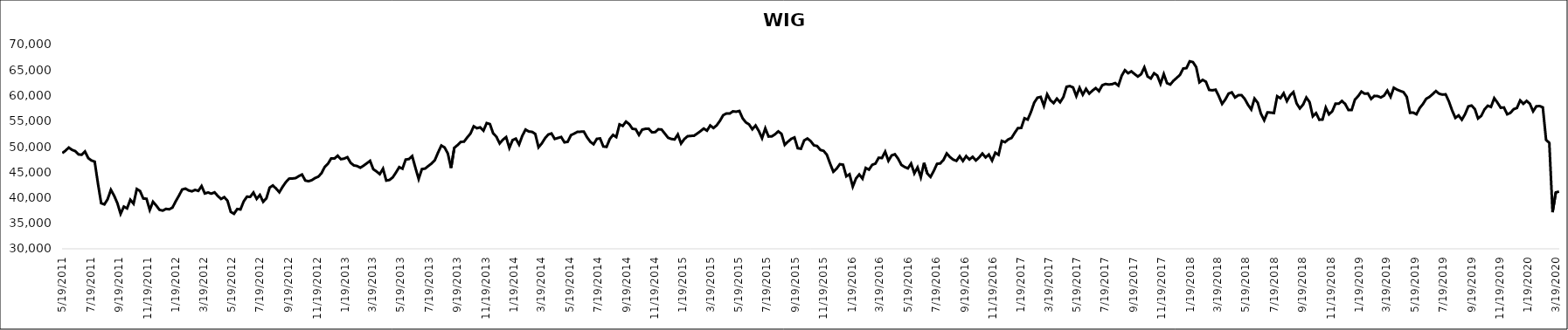
| Category | WIG |
|---|---|
| 5/19/11 | 48747.55 |
| 5/26/11 | 49215.53 |
| 6/2/11 | 49824.93 |
| 6/9/11 | 49378.82 |
| 6/16/11 | 49129.21 |
| 6/23/11 | 48485.26 |
| 6/30/11 | 48414.36 |
| 7/7/11 | 49057.05 |
| 7/14/11 | 47768.38 |
| 7/21/11 | 47291.31 |
| 7/28/11 | 47071.4 |
| 8/4/11 | 42828.22 |
| 8/11/11 | 38934.71 |
| 8/18/11 | 38697.56 |
| 8/25/11 | 39715.27 |
| 9/1/11 | 41553.09 |
| 9/8/11 | 40405.17 |
| 9/15/11 | 38945 |
| 9/22/11 | 36851.2 |
| 9/29/11 | 38264.32 |
| 10/6/11 | 37915.03 |
| 10/13/11 | 39608.13 |
| 10/20/11 | 38835.92 |
| 10/27/11 | 41708.88 |
| 11/3/11 | 41313.92 |
| 11/10/11 | 39853.18 |
| 11/17/11 | 39797.19 |
| 11/24/11 | 37607.27 |
| 12/1/11 | 39215.21 |
| 12/8/11 | 38474.28 |
| 12/15/11 | 37637.47 |
| 12/22/11 | 37478.7 |
| 12/29/11 | 37814.52 |
| 1/5/12 | 37739.39 |
| 1/12/12 | 38062.87 |
| 1/19/12 | 39288.13 |
| 1/26/12 | 40392.48 |
| 2/2/12 | 41602.24 |
| 2/9/12 | 41792.46 |
| 2/16/12 | 41430.3 |
| 2/23/12 | 41258.14 |
| 3/1/12 | 41533.87 |
| 3/8/12 | 41337.97 |
| 3/15/12 | 42281.33 |
| 3/22/12 | 40834.43 |
| 3/29/12 | 41028.06 |
| 4/5/12 | 40802.41 |
| 4/12/12 | 41053.82 |
| 4/19/12 | 40354.53 |
| 4/26/12 | 39761.78 |
| 5/3/12 | 40114.73 |
| 5/10/12 | 39404.16 |
| 5/17/12 | 37228.88 |
| 5/24/12 | 36852.75 |
| 5/31/12 | 37793.58 |
| 6/7/12 | 37707.25 |
| 6/14/12 | 39286.64 |
| 6/21/12 | 40207.61 |
| 6/28/12 | 40165.34 |
| 7/5/12 | 41013.96 |
| 7/12/12 | 39778.1 |
| 7/19/12 | 40545.64 |
| 7/26/12 | 39213.05 |
| 8/2/12 | 39876.95 |
| 8/9/12 | 41976.63 |
| 8/16/12 | 42408.41 |
| 8/23/12 | 41795.63 |
| 8/30/12 | 41077.44 |
| 9/6/12 | 42134.93 |
| 9/13/12 | 43047.41 |
| 9/20/12 | 43737.02 |
| 9/27/12 | 43763.3 |
| 10/4/12 | 43840.23 |
| 10/11/12 | 44224.67 |
| 10/18/12 | 44550.12 |
| 10/25/12 | 43374.6 |
| 11/1/12 | 43232.44 |
| 11/8/12 | 43429.42 |
| 11/15/12 | 43845.94 |
| 11/22/12 | 44121.53 |
| 11/29/12 | 44787.84 |
| 12/6/12 | 46019.97 |
| 12/13/12 | 46653.84 |
| 12/20/12 | 47701.82 |
| 12/27/12 | 47673.03 |
| 1/3/13 | 48222.72 |
| 1/10/13 | 47546.91 |
| 1/17/13 | 47661.37 |
| 1/24/13 | 47942.04 |
| 1/31/13 | 46840.15 |
| 2/7/13 | 46329.66 |
| 2/14/13 | 46211.54 |
| 2/21/13 | 45879.9 |
| 2/28/13 | 46280.36 |
| 3/7/13 | 46745.26 |
| 3/14/13 | 47223.68 |
| 3/21/13 | 45580.47 |
| 3/28/13 | 45147.57 |
| 4/4/13 | 44623.89 |
| 4/11/13 | 45688.48 |
| 4/18/13 | 43364.7 |
| 4/25/13 | 43482.18 |
| 5/2/13 | 43991.51 |
| 5/9/13 | 44943.16 |
| 5/16/13 | 45992.03 |
| 5/23/13 | 45687.76 |
| 5/30/13 | 47476.64 |
| 6/6/13 | 47573.66 |
| 6/13/13 | 48152.82 |
| 6/20/13 | 45870 |
| 6/27/13 | 43667.37 |
| 7/4/13 | 45613.75 |
| 7/11/13 | 45712.72 |
| 7/18/13 | 46221.23 |
| 7/25/13 | 46713.02 |
| 8/1/13 | 47370.81 |
| 8/8/13 | 48862.88 |
| 8/15/13 | 50223.95 |
| 8/22/13 | 49846.48 |
| 8/29/13 | 48676.45 |
| 9/5/13 | 45830.66 |
| 9/12/13 | 49771.55 |
| 9/19/13 | 50300.53 |
| 9/26/13 | 50936.34 |
| 10/3/13 | 50982.03 |
| 10/10/13 | 51806.83 |
| 10/17/13 | 52573.59 |
| 10/24/13 | 53994.46 |
| 10/31/13 | 53607.86 |
| 11/7/13 | 53785.07 |
| 11/14/13 | 53127.16 |
| 11/21/13 | 54621.21 |
| 11/28/13 | 54420.19 |
| 12/5/13 | 52597.13 |
| 12/12/13 | 51947.96 |
| 12/19/13 | 50631.75 |
| 12/26/13 | 51362.3 |
| 1/2/14 | 51865.89 |
| 1/9/14 | 49753.03 |
| 1/16/14 | 51288.7 |
| 1/23/14 | 51569.21 |
| 1/30/14 | 50417.17 |
| 2/6/14 | 52138.87 |
| 2/13/14 | 53349.65 |
| 2/20/14 | 52967.02 |
| 2/27/14 | 52906.04 |
| 3/6/14 | 52487.84 |
| 3/13/14 | 49878.65 |
| 3/20/14 | 50627.71 |
| 3/27/14 | 51642.99 |
| 4/3/14 | 52376.18 |
| 4/10/14 | 52580.73 |
| 4/17/14 | 51510.98 |
| 4/24/14 | 51705.76 |
| 5/1/14 | 51892.77 |
| 5/8/14 | 50851.25 |
| 5/15/14 | 50944.5 |
| 5/22/14 | 52244.13 |
| 5/29/14 | 52553.48 |
| 6/5/14 | 52901.29 |
| 6/12/14 | 52927.91 |
| 6/19/14 | 52937.45 |
| 6/26/14 | 51815.43 |
| 7/3/14 | 50951.73 |
| 7/10/14 | 50474.36 |
| 7/17/14 | 51527.37 |
| 7/24/14 | 51613.47 |
| 7/31/14 | 50037.12 |
| 8/7/14 | 49958.67 |
| 8/14/14 | 51512.57 |
| 8/21/14 | 52294.93 |
| 8/28/14 | 51882.01 |
| 9/4/14 | 54358.49 |
| 9/11/14 | 54065.27 |
| 9/18/14 | 54906.1 |
| 9/25/14 | 54411.77 |
| 10/2/14 | 53498.77 |
| 10/9/14 | 53416.03 |
| 10/16/14 | 52297.79 |
| 10/23/14 | 53335.43 |
| 10/30/14 | 53492 |
| 11/6/14 | 53512.14 |
| 11/13/14 | 52816.35 |
| 11/20/14 | 52848.54 |
| 11/27/14 | 53415.63 |
| 12/4/14 | 53346.86 |
| 12/11/14 | 52550.03 |
| 12/18/14 | 51739.04 |
| 12/25/14 | 51511.68 |
| 1/1/15 | 51416.08 |
| 1/8/15 | 52391 |
| 1/15/15 | 50616.63 |
| 1/22/15 | 51484.81 |
| 1/29/15 | 52040.24 |
| 2/5/15 | 52107.26 |
| 2/12/15 | 52139.81 |
| 2/19/15 | 52572.95 |
| 2/26/15 | 53042.6 |
| 3/5/15 | 53546.4 |
| 3/12/15 | 53136.13 |
| 3/19/15 | 54148.48 |
| 3/26/15 | 53649.9 |
| 4/2/15 | 54179.04 |
| 4/9/15 | 55063.85 |
| 4/16/15 | 56165.1 |
| 4/23/15 | 56492.95 |
| 4/30/15 | 56477.69 |
| 5/7/15 | 56911.34 |
| 5/14/15 | 56845.83 |
| 5/21/15 | 56990.6 |
| 5/28/15 | 55556.13 |
| 6/4/15 | 54749.74 |
| 6/11/15 | 54357.69 |
| 6/18/15 | 53408.53 |
| 6/25/15 | 54141.2 |
| 7/2/15 | 53074.71 |
| 7/9/15 | 51658.71 |
| 7/16/15 | 53588.24 |
| 7/23/15 | 51986.22 |
| 7/30/15 | 52011.81 |
| 8/6/15 | 52418.07 |
| 8/13/15 | 52995.96 |
| 8/20/15 | 52508.32 |
| 8/27/15 | 50366.09 |
| 9/3/15 | 50977.06 |
| 9/10/15 | 51527.08 |
| 9/17/15 | 51801.58 |
| 9/24/15 | 49701.31 |
| 10/1/15 | 49593.95 |
| 10/8/15 | 51222.77 |
| 10/15/15 | 51599.62 |
| 10/22/15 | 51094.29 |
| 10/29/15 | 50262.68 |
| 11/5/15 | 50125.85 |
| 11/12/15 | 49358.2 |
| 11/19/15 | 49177.74 |
| 11/26/15 | 48418.14 |
| 12/3/15 | 46693.09 |
| 12/10/15 | 45093.65 |
| 12/17/15 | 45684.05 |
| 12/24/15 | 46564.08 |
| 12/31/15 | 46467.38 |
| 1/7/16 | 44195.91 |
| 1/14/16 | 44596.08 |
| 1/21/16 | 42180.3 |
| 1/28/16 | 43778.96 |
| 2/4/16 | 44557.64 |
| 2/11/16 | 43741.96 |
| 2/18/16 | 45834.88 |
| 2/25/16 | 45497.77 |
| 3/3/16 | 46448.27 |
| 3/10/16 | 46686.74 |
| 3/17/16 | 47833.39 |
| 3/24/16 | 47778.01 |
| 3/31/16 | 49017.35 |
| 4/7/16 | 47231.36 |
| 4/14/16 | 48285.21 |
| 4/21/16 | 48514.39 |
| 4/28/16 | 47643.7 |
| 5/5/16 | 46430.16 |
| 5/12/16 | 46022.02 |
| 5/19/16 | 45751.68 |
| 5/26/16 | 46695.37 |
| 6/2/16 | 44772.72 |
| 6/9/16 | 45940.12 |
| 6/16/16 | 44007.81 |
| 6/23/16 | 46826.85 |
| 6/30/16 | 44748.53 |
| 7/7/16 | 44077.16 |
| 7/14/16 | 45246.26 |
| 7/21/16 | 46639.17 |
| 7/28/16 | 46718.98 |
| 8/4/16 | 47407.09 |
| 8/11/16 | 48675.96 |
| 8/18/16 | 47967.07 |
| 8/25/16 | 47464.07 |
| 9/1/16 | 47221.32 |
| 9/8/16 | 48129.15 |
| 9/15/16 | 47198.39 |
| 9/22/16 | 48154.88 |
| 9/29/16 | 47494.62 |
| 10/6/16 | 48014.44 |
| 10/13/16 | 47303.15 |
| 10/20/16 | 47894.17 |
| 10/27/16 | 48651.28 |
| 11/3/16 | 47899.61 |
| 11/10/16 | 48447.59 |
| 11/17/16 | 47274.21 |
| 11/24/16 | 48824.83 |
| 12/1/16 | 48404.21 |
| 12/8/16 | 51123.43 |
| 12/15/16 | 50881.35 |
| 12/22/16 | 51423.71 |
| 12/29/16 | 51703.91 |
| 1/5/17 | 52721.67 |
| 1/12/17 | 53650.94 |
| 1/19/17 | 53654.99 |
| 1/26/17 | 55560.23 |
| 2/2/17 | 55303.11 |
| 2/9/17 | 56785.52 |
| 2/16/17 | 58610.28 |
| 2/23/17 | 59583.89 |
| 3/2/17 | 59743.64 |
| 3/9/17 | 57986.6 |
| 3/16/17 | 60247.18 |
| 3/23/17 | 59093.68 |
| 3/30/17 | 58527.2 |
| 4/6/17 | 59406.36 |
| 4/13/17 | 58695.36 |
| 4/20/17 | 59700.07 |
| 4/27/17 | 61731.8 |
| 5/4/17 | 61862.8 |
| 5/11/17 | 61598.78 |
| 5/18/17 | 59901.12 |
| 5/25/17 | 61536.22 |
| 6/1/17 | 60181.96 |
| 6/8/17 | 61312.68 |
| 6/15/17 | 60381.07 |
| 6/22/17 | 60987.33 |
| 6/29/17 | 61475.96 |
| 7/6/17 | 60869.83 |
| 7/13/17 | 62018.68 |
| 7/20/17 | 62269.72 |
| 7/27/17 | 62171.7 |
| 8/3/17 | 62231.08 |
| 8/10/17 | 62451.57 |
| 8/17/17 | 61949.4 |
| 8/24/17 | 63886.54 |
| 8/31/17 | 64973.76 |
| 9/7/17 | 64381.87 |
| 9/14/17 | 64748.47 |
| 9/21/17 | 64209.19 |
| 9/28/17 | 63729.77 |
| 10/5/17 | 64185.71 |
| 10/12/17 | 65529.1 |
| 10/19/17 | 63745 |
| 10/26/17 | 63342.71 |
| 11/2/17 | 64375.83 |
| 11/9/17 | 63923.62 |
| 11/16/17 | 62299.29 |
| 11/23/17 | 64207.77 |
| 11/30/17 | 62440.31 |
| 12/7/17 | 62164.65 |
| 12/14/17 | 62916.39 |
| 12/21/17 | 63477.25 |
| 12/28/17 | 64053.47 |
| 1/4/18 | 65297.96 |
| 1/11/18 | 65379.88 |
| 1/18/18 | 66709.12 |
| 1/25/18 | 66561.79 |
| 2/1/18 | 65585.79 |
| 2/8/18 | 62604.89 |
| 2/15/18 | 63078.16 |
| 2/22/18 | 62717.27 |
| 3/1/18 | 61116.96 |
| 3/8/18 | 61036.99 |
| 3/15/18 | 61156.91 |
| 3/22/18 | 59862.55 |
| 3/29/18 | 58377.42 |
| 4/5/18 | 59244.04 |
| 4/12/18 | 60393.23 |
| 4/19/18 | 60629.81 |
| 4/26/18 | 59628.04 |
| 5/3/18 | 60066.46 |
| 5/10/18 | 60091.26 |
| 5/17/18 | 59337.27 |
| 5/24/18 | 58189.49 |
| 5/31/18 | 57282.73 |
| 6/7/18 | 59412.76 |
| 6/14/18 | 58603.93 |
| 6/21/18 | 56425.25 |
| 6/28/18 | 55169.77 |
| 7/5/18 | 56719.88 |
| 7/12/18 | 56671.44 |
| 7/19/18 | 56585.5 |
| 7/26/18 | 59871.2 |
| 8/2/18 | 59484.35 |
| 8/9/18 | 60455.75 |
| 8/16/18 | 58921.44 |
| 8/23/18 | 60044.45 |
| 8/30/18 | 60690.32 |
| 9/6/18 | 58469.6 |
| 9/13/18 | 57493.38 |
| 9/20/18 | 58231.57 |
| 9/27/18 | 59616.27 |
| 10/4/18 | 58736.08 |
| 10/11/18 | 55941.06 |
| 10/18/18 | 56560.93 |
| 10/25/18 | 55271.63 |
| 11/1/18 | 55312.71 |
| 11/8/18 | 57655.73 |
| 11/15/18 | 56329.01 |
| 11/22/18 | 56932.62 |
| 11/29/18 | 58412.94 |
| 12/6/18 | 58409.09 |
| 12/13/18 | 58952.55 |
| 12/20/18 | 58349.03 |
| 12/27/18 | 57183.28 |
| 1/3/19 | 57192.42 |
| 1/10/19 | 59219.23 |
| 1/17/19 | 59894.9 |
| 1/24/19 | 60791.02 |
| 1/31/19 | 60367.42 |
| 2/7/19 | 60422.38 |
| 2/14/19 | 59348.4 |
| 2/21/19 | 59938.07 |
| 2/28/19 | 59903.7 |
| 3/7/19 | 59638.3 |
| 3/14/19 | 60002.72 |
| 3/21/19 | 60976.51 |
| 3/28/19 | 59752.66 |
| 4/4/19 | 61533.27 |
| 4/11/19 | 61168.92 |
| 4/18/19 | 60910.11 |
| 4/25/19 | 60680.62 |
| 5/2/19 | 59744.3 |
| 5/9/19 | 56637.25 |
| 5/16/19 | 56664.5 |
| 5/23/19 | 56351.13 |
| 5/30/19 | 57566.83 |
| 6/6/19 | 58360.5 |
| 6/13/19 | 59374.38 |
| 6/20/19 | 59738.56 |
| 6/27/19 | 60293.37 |
| 7/4/19 | 60888.98 |
| 7/11/19 | 60362.11 |
| 7/18/19 | 60192.6 |
| 7/25/19 | 60249.72 |
| 8/1/19 | 58863.73 |
| 8/8/19 | 57102.69 |
| 8/15/19 | 55634.7 |
| 8/22/19 | 56118.92 |
| 8/29/19 | 55273.05 |
| 9/5/19 | 56358.3 |
| 9/12/19 | 57886.6 |
| 9/19/19 | 58053.03 |
| 9/26/19 | 57377.87 |
| 10/3/19 | 55523.06 |
| 10/10/19 | 56034.97 |
| 10/17/19 | 57297.12 |
| 10/24/19 | 58012.97 |
| 10/31/19 | 57783.02 |
| 11/7/19 | 59492.22 |
| 11/14/19 | 58622.1 |
| 11/21/19 | 57618.54 |
| 11/28/19 | 57669.94 |
| 12/5/19 | 56338.75 |
| 12/12/19 | 56621.06 |
| 12/19/19 | 57346.95 |
| 12/26/19 | 57569.71 |
| 1/2/20 | 59048.28 |
| 1/9/20 | 58397.17 |
| 1/16/20 | 58962.37 |
| 1/23/20 | 58401.85 |
| 1/30/20 | 56923.36 |
| 2/6/20 | 57900.04 |
| 2/13/20 | 57960.23 |
| 2/20/20 | 57693.12 |
| 2/27/20 | 51318.69 |
| 3/5/20 | 50753.91 |
| 3/12/20 | 37164.02 |
| 3/19/20 | 41041.92 |
| 3/26/20 | 41202.98 |